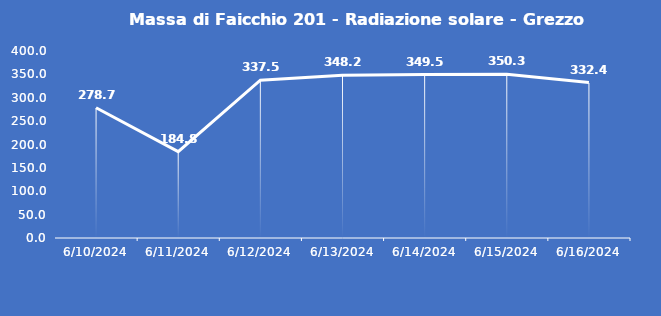
| Category | Massa di Faicchio 201 - Radiazione solare - Grezzo (W/m2) |
|---|---|
| 6/10/24 | 278.7 |
| 6/11/24 | 184.8 |
| 6/12/24 | 337.5 |
| 6/13/24 | 348.2 |
| 6/14/24 | 349.5 |
| 6/15/24 | 350.3 |
| 6/16/24 | 332.4 |